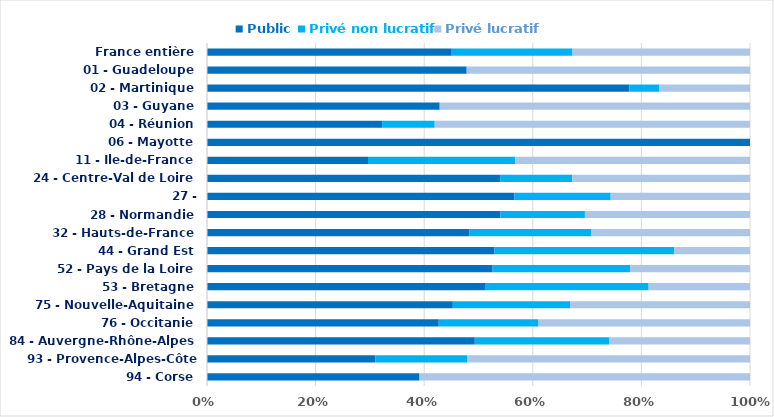
| Category | Public | Privé non lucratif | Privé lucratif |
|---|---|---|---|
| France entière | 1354 | 668 | 982 |
| 01 - Guadeloupe | 11 | 0 | 12 |
| 02 - Martinique | 14 | 1 | 3 |
| 03 - Guyane | 3 | 0 | 4 |
| 04 - Réunion | 10 | 3 | 18 |
| 06 - Mayotte | 1 | 0 | 0 |
| 11 - Ile-de-France | 118 | 108 | 172 |
| 24 - Centre-Val de Loire | 61 | 15 | 37 |
| 27 - Bourgogne-Franche-Comté | 86 | 27 | 39 |
| 28 - Normandie | 80 | 23 | 45 |
| 32 - Hauts-de-France | 119 | 55 | 72 |
| 44 - Grand Est | 144 | 90 | 38 |
| 52 - Pays de la Loire | 81 | 39 | 34 |
| 53 - Bretagne | 77 | 45 | 28 |
| 75 - Nouvelle-Aquitaine | 134 | 64 | 98 |
| 76 - Occitanie | 137 | 59 | 125 |
| 84 - Auvergne-Rhône-Alpes | 181 | 91 | 95 |
| 93 - Provence-Alpes-Côte d'Azur | 88 | 48 | 148 |
| 94 - Corse | 9 | 0 | 14 |